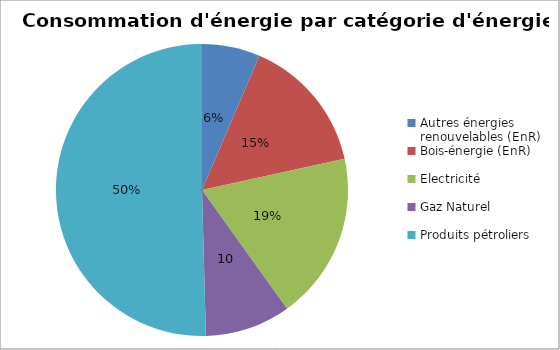
| Category | Series 0 |
|---|---|
| Autres énergies renouvelables (EnR) | 32903.191 |
| Bois-énergie (EnR) | 77529.508 |
| Electricité | 94800.654 |
| Gaz Naturel | 48467.48 |
| Produits pétroliers | 258059.201 |